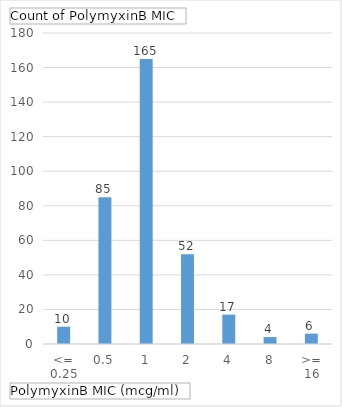
| Category | Total |
|---|---|
| <= 0.25 | 10 |
| 0.5 | 85 |
| 1 | 165 |
| 2 | 52 |
| 4 | 17 |
| 8 | 4 |
| >= 16 | 6 |